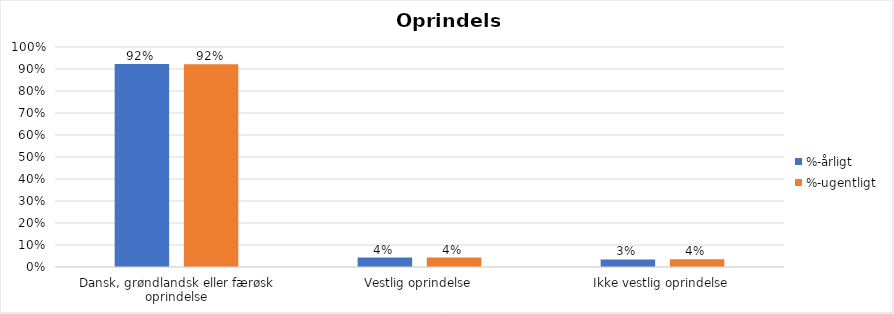
| Category | %-årligt | %-ugentligt |
|---|---|---|
| Dansk, grøndlandsk eller færøsk oprindelse | 0.923 | 0.922 |
| Vestlig oprindelse | 0.043 | 0.043 |
| Ikke vestlig oprindelse | 0.035 | 0.036 |